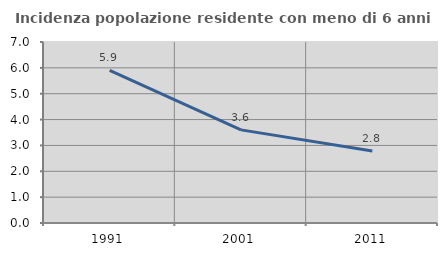
| Category | Incidenza popolazione residente con meno di 6 anni |
|---|---|
| 1991.0 | 5.903 |
| 2001.0 | 3.602 |
| 2011.0 | 2.785 |